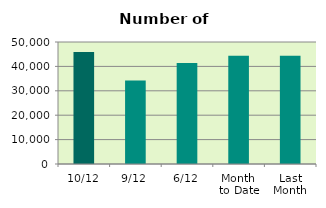
| Category | Series 0 |
|---|---|
| 10/12 | 45868 |
| 9/12 | 34172 |
| 6/12 | 41344 |
| Month 
to Date | 44346 |
| Last
Month | 44331.238 |